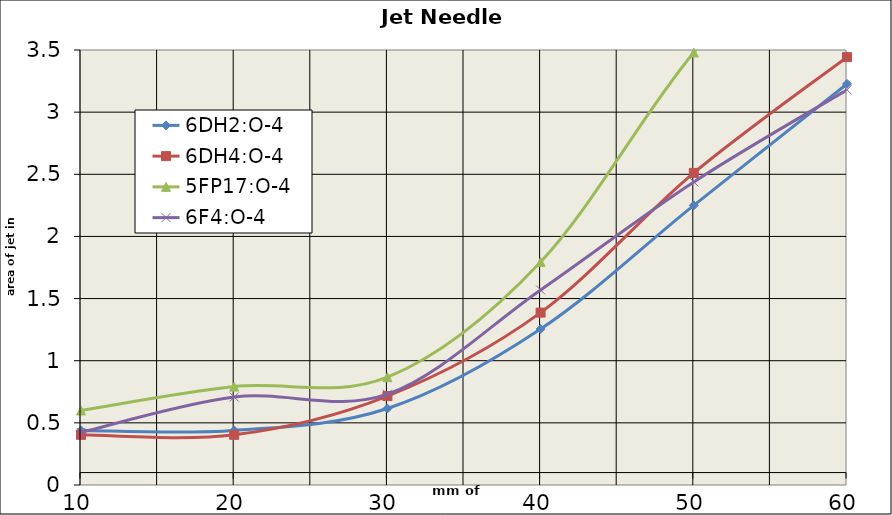
| Category | 6DH2:O-4 | 6DH4:O-4 | 5FP17:O-4 | 6F4:O-4 |
|---|---|---|---|---|
| 10.0 | 0.439 | 0.404 | 0.6 | 0.423 |
| 20.0 | 0.439 | 0.404 | 0.792 | 0.708 |
| 30.0 | 0.615 | 0.715 | 0.867 | 0.731 |
| 40.0 | 1.255 | 1.387 | 1.794 | 1.569 |
| 50.0 | 2.25 | 2.511 | 3.48 | 2.438 |
| 60.0 | 3.227 | 3.443 | 4.755 | 3.18 |